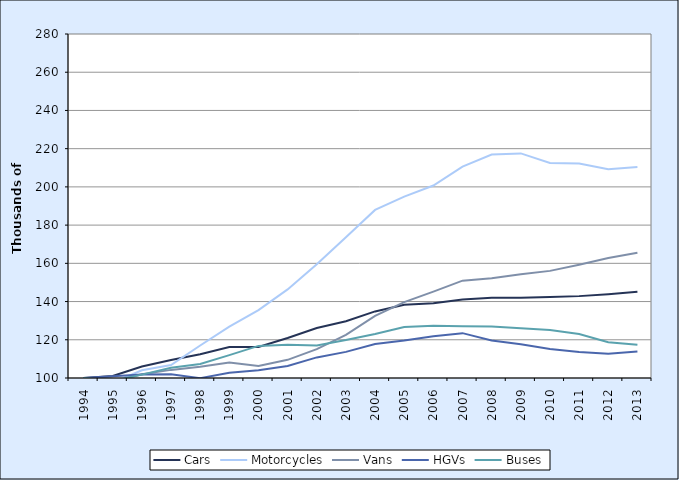
| Category | Cars | Motorcycles | Vans | HGVs | Buses |
|---|---|---|---|---|---|
| 1994.0 | 100 | 100 | 100 | 100 | 100 |
| 1995.0 | 101.097 | 97.591 | 97.949 | 100.863 | 98.504 |
| 1996.0 | 106.052 | 104.009 | 101.969 | 101.823 | 101.771 |
| 1997.0 | 109.374 | 106.807 | 104.246 | 101.942 | 105.409 |
| 1998.0 | 112.422 | 117.003 | 105.886 | 99.924 | 107.311 |
| 1999.0 | 116.183 | 126.838 | 108.066 | 102.794 | 111.966 |
| 2000.0 | 116.237 | 135.546 | 106.248 | 104.058 | 116.788 |
| 2001.0 | 120.925 | 146.35 | 109.496 | 106.305 | 117.375 |
| 2002.0 | 126.129 | 159.575 | 115.076 | 110.781 | 117.028 |
| 2003.0 | 129.69 | 173.647 | 122.618 | 113.678 | 119.852 |
| 2004.0 | 134.839 | 187.945 | 132.503 | 117.764 | 123.059 |
| 2005.0 | 138.325 | 194.936 | 139.68 | 119.581 | 126.66 |
| 2006.0 | 139.105 | 200.7 | 145.172 | 121.806 | 127.402 |
| 2007.0 | 141.114 | 210.624 | 150.945 | 123.466 | 127.079 |
| 2008.0 | 141.989 | 216.915 | 152.156 | 119.673 | 126.936 |
| 2009.0 | 141.993 | 217.511 | 154.346 | 117.709 | 126.086 |
| 2010.0 | 142.423 | 212.551 | 156.049 | 115.23 | 125.141 |
| 2011.0 | 142.842 | 212.19 | 159.267 | 113.667 | 123.023 |
| 2012.0 | 143.824 | 209.223 | 162.761 | 112.642 | 118.691 |
| 2013.0 | 145.096 | 210.374 | 165.586 | 113.819 | 117.423 |